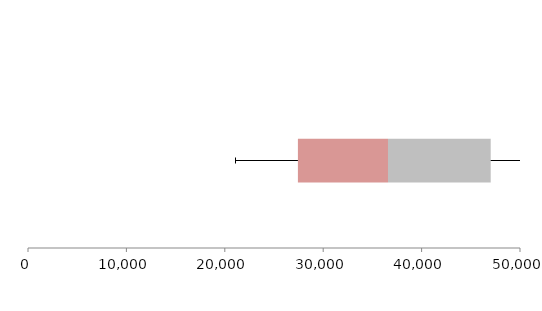
| Category | Series 1 | Series 2 | Series 3 |
|---|---|---|---|
| 0 | 27430.09 | 9154.385 | 10437.944 |